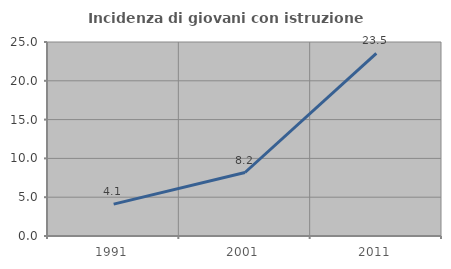
| Category | Incidenza di giovani con istruzione universitaria |
|---|---|
| 1991.0 | 4.103 |
| 2001.0 | 8.182 |
| 2011.0 | 23.529 |